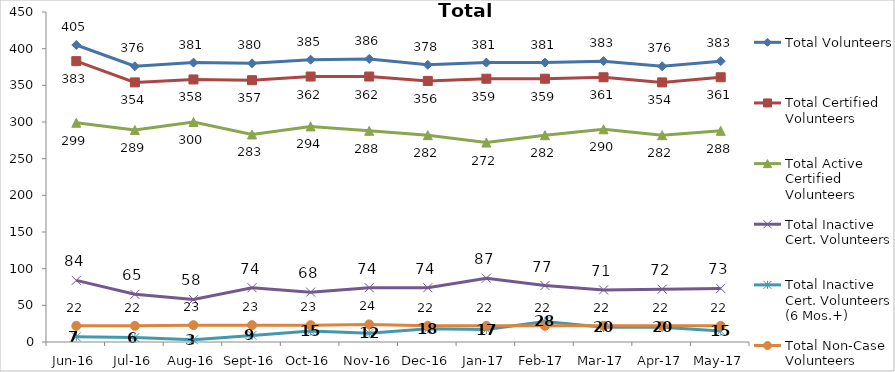
| Category | Total Volunteers | Total Certified Volunteers | Total Active Certified Volunteers | Total Inactive Cert. Volunteers | Total Inactive Cert. Volunteers (6 Mos.+) | Total Non-Case Volunteers |
|---|---|---|---|---|---|---|
| Jun-16 | 405 | 383 | 299 | 84 | 7 | 22 |
| Jul-16 | 376 | 354 | 289 | 65 | 6 | 22 |
| Aug-16 | 381 | 358 | 300 | 58 | 3 | 23 |
| Sep-16 | 380 | 357 | 283 | 74 | 9 | 23 |
| Oct-16 | 385 | 362 | 294 | 68 | 15 | 23 |
| Nov-16 | 386 | 362 | 288 | 74 | 12 | 24 |
| Dec-16 | 378 | 356 | 282 | 74 | 18 | 22 |
| Jan-17 | 381 | 359 | 272 | 87 | 17 | 22 |
| Feb-17 | 381 | 359 | 282 | 77 | 28 | 22 |
| Mar-17 | 383 | 361 | 290 | 71 | 20 | 22 |
| Apr-17 | 376 | 354 | 282 | 72 | 20 | 22 |
| May-17 | 383 | 361 | 288 | 73 | 15 | 22 |